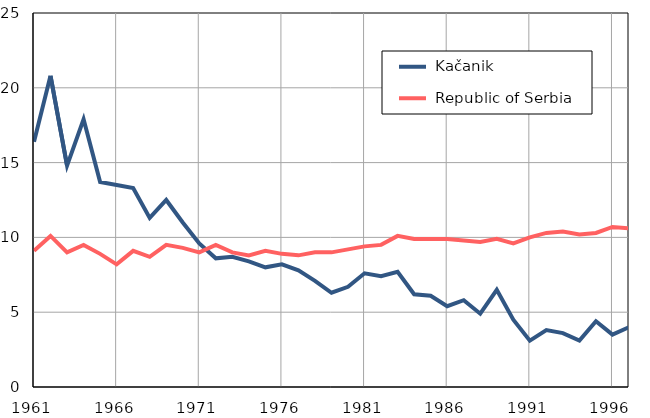
| Category |  Kačanik |  Republic of Serbia |
|---|---|---|
| 1961.0 | 16.4 | 9.1 |
| 1962.0 | 20.8 | 10.1 |
| 1963.0 | 14.8 | 9 |
| 1964.0 | 17.9 | 9.5 |
| 1965.0 | 13.7 | 8.9 |
| 1966.0 | 13.5 | 8.2 |
| 1967.0 | 13.3 | 9.1 |
| 1968.0 | 11.3 | 8.7 |
| 1969.0 | 12.5 | 9.5 |
| 1970.0 | 11 | 9.3 |
| 1971.0 | 9.6 | 9 |
| 1972.0 | 8.6 | 9.5 |
| 1973.0 | 8.7 | 9 |
| 1974.0 | 8.4 | 8.8 |
| 1975.0 | 8 | 9.1 |
| 1976.0 | 8.2 | 8.9 |
| 1977.0 | 7.8 | 8.8 |
| 1978.0 | 7.1 | 9 |
| 1979.0 | 6.3 | 9 |
| 1980.0 | 6.7 | 9.2 |
| 1981.0 | 7.6 | 9.4 |
| 1982.0 | 7.4 | 9.5 |
| 1983.0 | 7.7 | 10.1 |
| 1984.0 | 6.2 | 9.9 |
| 1985.0 | 6.1 | 9.9 |
| 1986.0 | 5.4 | 9.9 |
| 1987.0 | 5.8 | 9.8 |
| 1988.0 | 4.9 | 9.7 |
| 1989.0 | 6.5 | 9.9 |
| 1990.0 | 4.5 | 9.6 |
| 1991.0 | 3.1 | 10 |
| 1992.0 | 3.8 | 10.3 |
| 1993.0 | 3.6 | 10.4 |
| 1994.0 | 3.1 | 10.2 |
| 1995.0 | 4.4 | 10.3 |
| 1996.0 | 3.5 | 10.7 |
| 1997.0 | 4 | 10.6 |